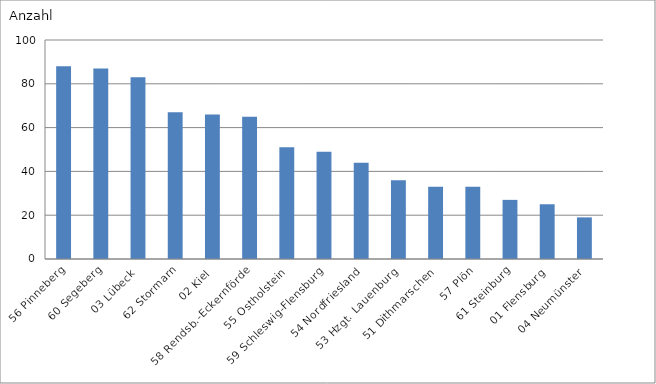
| Category | 56 Pinneberg |
|---|---|
| 56 Pinneberg | 88 |
| 60 Segeberg | 87 |
| 03 Lübeck | 83 |
| 62 Stormarn | 67 |
| 02 Kiel | 66 |
| 58 Rendsb.-Eckernförde | 65 |
| 55 Ostholstein | 51 |
| 59 Schleswig-Flensburg | 49 |
| 54 Nordfriesland | 44 |
| 53 Hzgt. Lauenburg | 36 |
| 51 Dithmarschen | 33 |
| 57 Plön | 33 |
| 61 Steinburg | 27 |
| 01 Flensburg | 25 |
| 04 Neumünster | 19 |